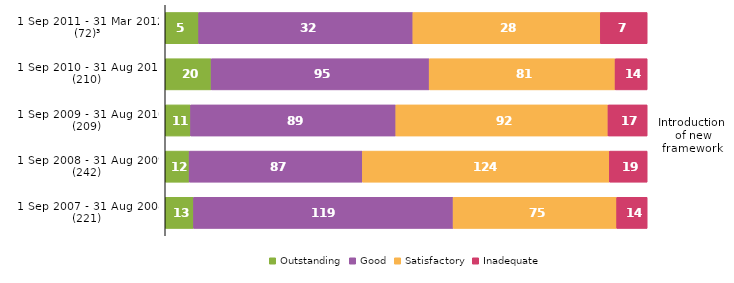
| Category | Outstanding | Good | Satisfactory | Inadequate |
|---|---|---|---|---|
| 1 Sep 2011 - 31 Mar 2012 (72)³ | 5 | 32 | 28 | 7 |
| 1 Sep 2010 - 31 Aug 2011 (210) | 20 | 95 | 81 | 14 |
| 1 Sep 2009 - 31 Aug 2010 (209) | 11 | 89 | 92 | 17 |
| 1 Sep 2008 - 31 Aug 2009 (242) | 12 | 87 | 124 | 19 |
| 1 Sep 2007 - 31 Aug 2008 (221) | 13 | 119 | 75 | 14 |